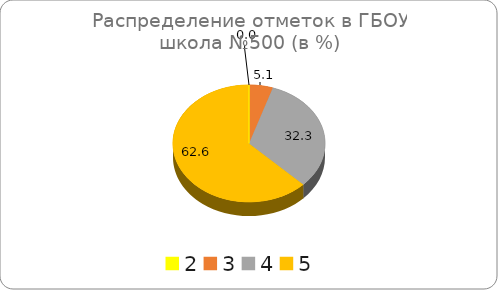
| Category | ГБОУ СОШ №500 |
|---|---|
| 2.0 | 0 |
| 3.0 | 5.05 |
| 4.0 | 32.32 |
| 5.0 | 62.63 |